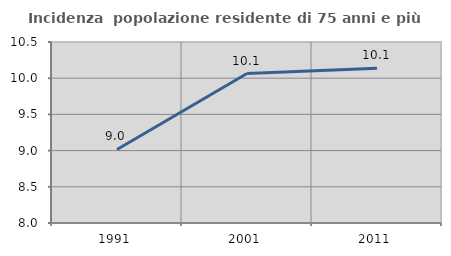
| Category | Incidenza  popolazione residente di 75 anni e più |
|---|---|
| 1991.0 | 9.016 |
| 2001.0 | 10.064 |
| 2011.0 | 10.138 |